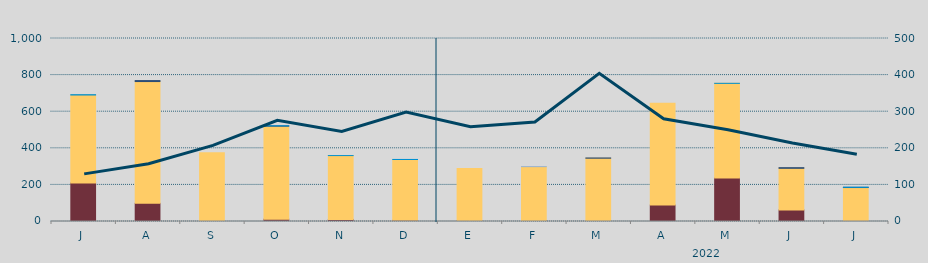
| Category | Carbón | Ciclo Combinado | Cogeneración | Consumo Bombeo | Eólica | Hidráulica | Otras Renovables | Solar fotovoltaica | Solar térmica | Turbinación bombeo | Nuclear |
|---|---|---|---|---|---|---|---|---|---|---|---|
| J | 210445 | 480749.8 | 0 | 0 | 0 | 1914.7 | 0 | 0 | 0 | 0 | 0 |
| A | 99208.5 | 665537.8 | 0 | 5384.9 | 0 | 0 | 0 | 0 | 0 | 0 | 0 |
| S | 634 | 375205.9 | 0 | 0 | 0 | 0 | 0 | 0 | 0 | 0 | 0 |
| O | 12750 | 508119.2 | 0 | 1625.9 | 0 | 597.8 | 0 | 0 | 0 | 0 | 0 |
| N | 11251 | 348916.7 | 0 | 0 | 0 | 100 | 0 | 0 | 0 | 0 | 0 |
| D | 6493 | 332239.3 | 0 | 0 | 0 | 335 | 0 | 0 | 0 | 0 | 0 |
| E | 4320 | 285393.5 | 0 | 0 | 0 | 0 | 0 | 0 | 0 | 0 | 0 |
| F | 5118.6 | 294678.7 | 0 | 0 | 0 | 0 | 0 | 0 | 0 | 84.5 | 0 |
| M | 280 | 345584.7 | 0 | 1304.2 | 0 | 0 | 0 | 0 | 0 | 0 | 0 |
| A | 89745.4 | 556069.1 | 0 | 0 | 0 | 0 | 0 | 0 | 0 | 0 | 0 |
| M | 238246.1 | 516625.8 | 0 | 0 | 0 | 170 | 0 | 0 | 0 | 0 | 0 |
| J | 63431.6 | 227120.9 | 0 | 3696.9 | 0 | 0 | 0 | 0 | 0 | 0 | 0 |
| J | 347.9 | 185242.2 | 0 | 1000 | 0 | 958 | 0 | 0 | 0 | 0 | 0 |